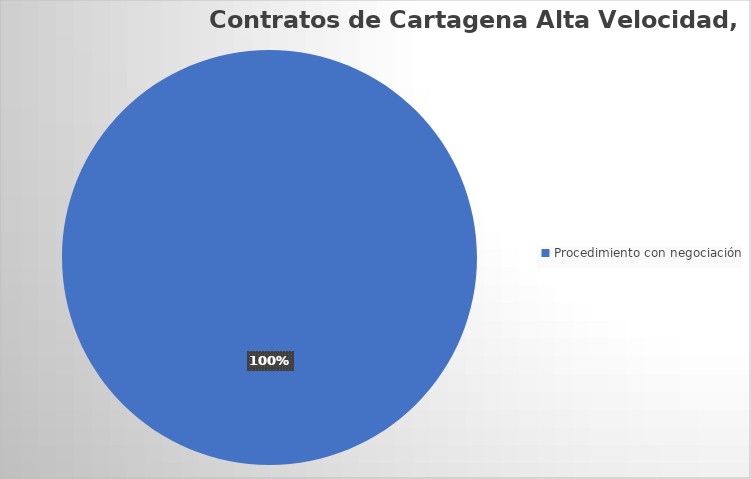
| Category | Series 0 |
|---|---|
| Procedimiento con negociación | 1 |